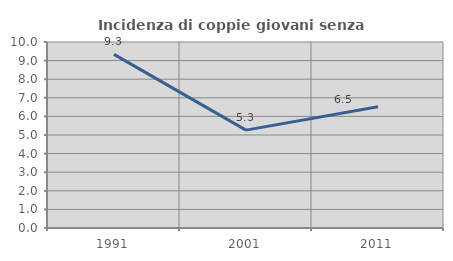
| Category | Incidenza di coppie giovani senza figli |
|---|---|
| 1991.0 | 9.333 |
| 2001.0 | 5.263 |
| 2011.0 | 6.522 |